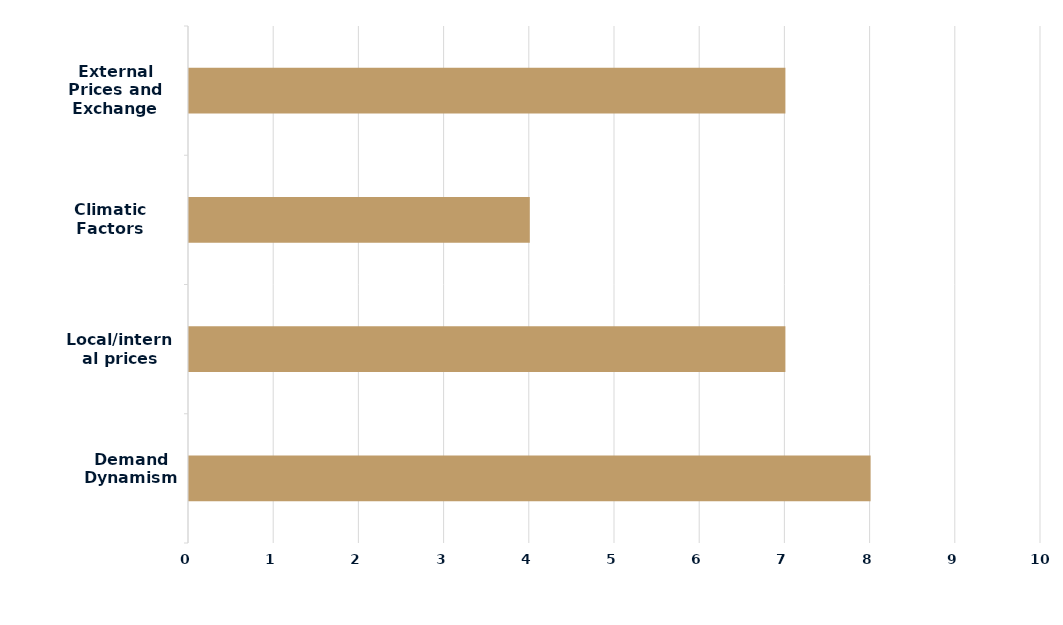
| Category | Series 0 |
|---|---|
| Demand Dynamism | 8 |
| Local/internal prices | 7 |
| Climatic Factors | 4 |
| External Prices and Exchange Rate | 7 |